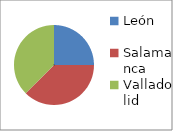
| Category | Series 0 |
|---|---|
| León | 2 |
| Salamanca | 3 |
| Valladolid | 3 |